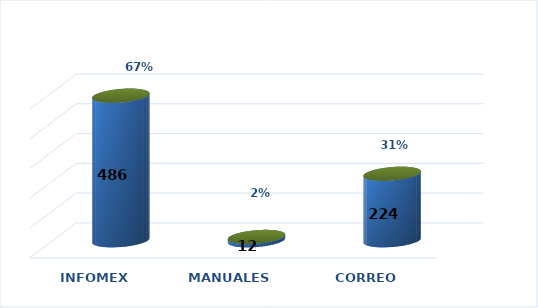
| Category | Series 0 | Series 1 |
|---|---|---|
| INFOMEX | 486 | 0.673 |
| MANUALES | 12 | 0.017 |
| CORREO | 224 | 0.31 |